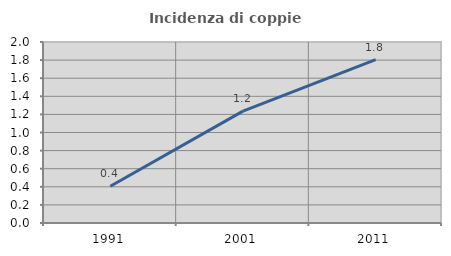
| Category | Incidenza di coppie miste |
|---|---|
| 1991.0 | 0.406 |
| 2001.0 | 1.236 |
| 2011.0 | 1.806 |